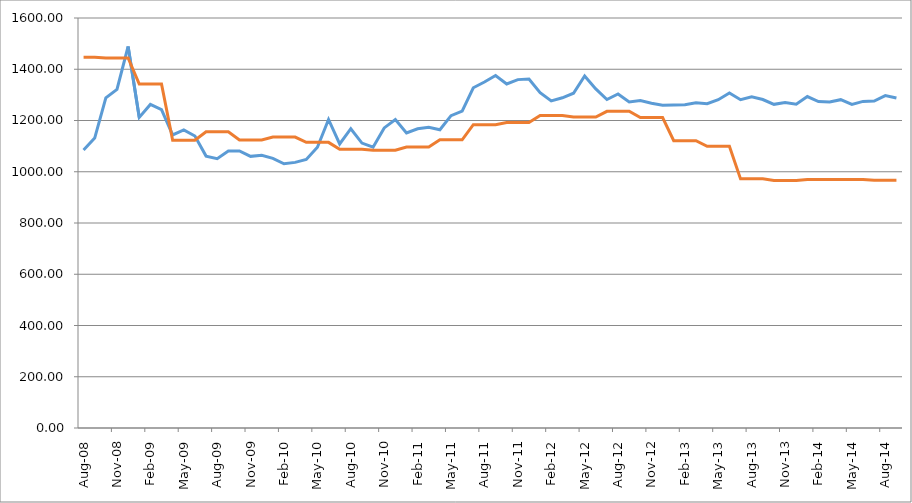
| Category | Series 0 | Series 1 |
|---|---|---|
| 2008-08-01 | 1085.131 | 1446.67 |
| 2008-09-01 | 1131.279 | 1446.67 |
| 2008-10-01 | 1288.296 | 1443.905 |
| 2008-11-01 | 1321.413 | 1443.905 |
| 2008-12-01 | 1488.774 | 1443.905 |
| 2009-01-01 | 1211.995 | 1342.135 |
| 2009-02-01 | 1262.757 | 1342.135 |
| 2009-03-01 | 1242.622 | 1342.135 |
| 2009-04-01 | 1143.699 | 1122.813 |
| 2009-05-01 | 1163.631 | 1122.813 |
| 2009-06-01 | 1139.283 | 1122.813 |
| 2009-07-01 | 1061.118 | 1156.092 |
| 2009-08-01 | 1051.27 | 1156.092 |
| 2009-09-01 | 1081.246 | 1156.092 |
| 2009-10-01 | 1081.062 | 1124.223 |
| 2009-11-01 | 1060.032 | 1124.223 |
| 2009-12-01 | 1063.922 | 1124.223 |
| 2010-01-01 | 1052.311 | 1135.141 |
| 2010-02-01 | 1030.97 | 1135.141 |
| 2010-03-01 | 1036.602 | 1135.141 |
| 2010-04-01 | 1047.828 | 1114.684 |
| 2010-05-01 | 1095.377 | 1114.684 |
| 2010-06-01 | 1203.922 | 1114.684 |
| 2010-07-01 | 1108.493 | 1087.461 |
| 2010-08-01 | 1167.86 | 1087.461 |
| 2010-09-01 | 1111.879 | 1087.461 |
| 2010-10-01 | 1095.92 | 1083.956 |
| 2010-11-01 | 1171.052 | 1083.956 |
| 2010-12-01 | 1203.664 | 1083.956 |
| 2011-01-01 | 1151.466 | 1096.748 |
| 2011-02-01 | 1167.883 | 1096.748 |
| 2011-03-01 | 1173.533 | 1096.748 |
| 2011-04-01 | 1163.826 | 1124.726 |
| 2011-05-01 | 1218.95 | 1124.726 |
| 2011-06-01 | 1236.717 | 1124.726 |
| 2011-07-01 | 1327.751 | 1183.707 |
| 2011-08-01 | 1350.083 | 1183.707 |
| 2011-09-01 | 1375.639 | 1183.707 |
| 2011-10-01 | 1342.62 | 1192.025 |
| 2011-11-01 | 1359.513 | 1192.025 |
| 2011-12-01 | 1361.634 | 1192.025 |
| 2012-01-01 | 1308.662 | 1219.367 |
| 2012-02-01 | 1276.655 | 1219.367 |
| 2012-03-01 | 1288.718 | 1219.367 |
| 2012-04-01 | 1306.536 | 1213.437 |
| 2012-05-01 | 1373.849 | 1213.437 |
| 2012-06-01 | 1323.317 | 1213.437 |
| 2012-07-01 | 1281.802 | 1235.897 |
| 2012-08-01 | 1303.572 | 1235.897 |
| 2012-09-01 | 1272.155 | 1235.897 |
| 2012-10-01 | 1277.557 | 1211.243 |
| 2012-11-01 | 1267.074 | 1211.243 |
| 2012-12-01 | 1259.762 | 1211.243 |
| 2013-01-01 | 1260.348 | 1121.206 |
| 2013-02-01 | 1261.129 | 1121.206 |
| 2013-03-01 | 1268.935 | 1121.206 |
| 2013-04-01 | 1265.65 | 1099.11 |
| 2013-05-01 | 1281.095 | 1099.11 |
| 2013-06-01 | 1307.482 | 1099.11 |
| 2013-07-01 | 1281.021 | 972.203 |
| 2013-08-01 | 1292.335 | 972.203 |
| 2013-09-01 | 1281.951 | 972.203 |
| 2013-10-01 | 1263.082 | 966.124 |
| 2013-11-01 | 1270.414 | 966.124 |
| 2013-12-01 | 1263.677 | 966.124 |
| 2014-01-01 | 1293.488 | 970.141 |
| 2014-02-01 | 1274.135 | 970.141 |
| 2014-03-01 | 1271.977 | 970.141 |
| 2014-04-01 | 1281.318 | 970.141 |
| 2014-05-01 | 1263.082 | 970.141 |
| 2014-06-01 | 1274.545 | 970.141 |
| 2014-07-01 | 1276.18 | 967.177 |
| 2014-08-01 | 1297.035 | 967.177 |
| 2014-09-01 | 1287.63 | 967.177 |